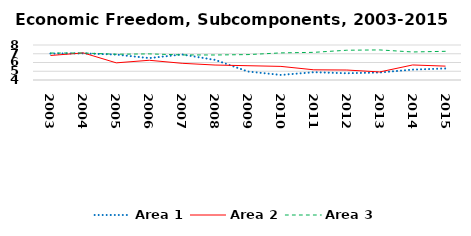
| Category | Area 1 | Area 2 | Area 3 |
|---|---|---|---|
| 2003.0 | 7.02 | 6.802 | 7.08 |
| 2004.0 | 7.045 | 7.095 | 7.082 |
| 2005.0 | 6.902 | 5.959 | 6.946 |
| 2006.0 | 6.504 | 6.255 | 6.984 |
| 2007.0 | 6.916 | 5.907 | 6.867 |
| 2008.0 | 6.296 | 5.71 | 6.859 |
| 2009.0 | 4.969 | 5.633 | 6.903 |
| 2010.0 | 4.579 | 5.554 | 7.097 |
| 2011.0 | 4.888 | 5.166 | 7.16 |
| 2012.0 | 4.771 | 5.14 | 7.402 |
| 2013.0 | 4.857 | 4.921 | 7.437 |
| 2014.0 | 5.187 | 5.718 | 7.203 |
| 2015.0 | 5.32 | 5.584 | 7.279 |